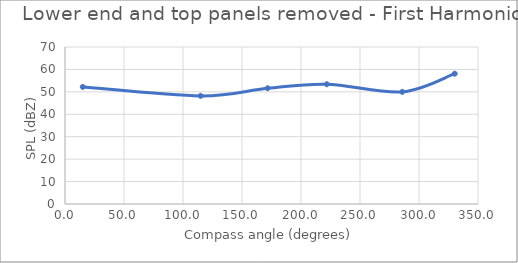
| Category | Series 0 |
|---|---|
| 15.06445125542554 | 52.2 |
| 115.00449447818254 | 48.2 |
| 171.7068171198818 | 51.6 |
| 221.8691292075067 | 53.4 |
| 285.7828166838848 | 50 |
| 330.28010595813004 | 58.1 |